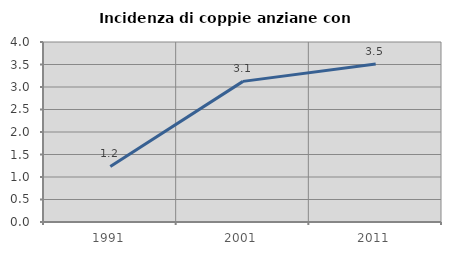
| Category | Incidenza di coppie anziane con figli |
|---|---|
| 1991.0 | 1.235 |
| 2001.0 | 3.125 |
| 2011.0 | 3.509 |